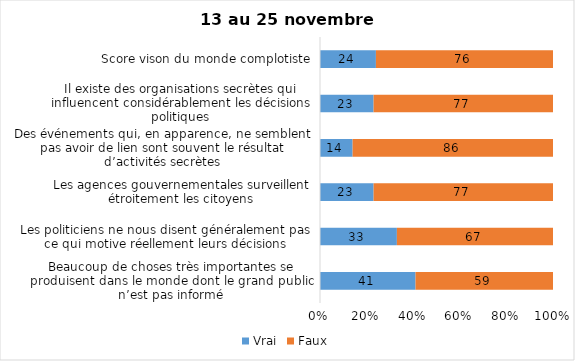
| Category | Vrai | Faux |
|---|---|---|
| Beaucoup de choses très importantes se produisent dans le monde dont le grand public n’est pas informé | 41 | 59 |
| Les politiciens ne nous disent généralement pas ce qui motive réellement leurs décisions | 33 | 67 |
| Les agences gouvernementales surveillent étroitement les citoyens | 23 | 77 |
| Des événements qui, en apparence, ne semblent pas avoir de lien sont souvent le résultat d’activités secrètes | 14 | 86 |
| Il existe des organisations secrètes qui influencent considérablement les décisions politiques | 23 | 77 |
| Score vison du monde complotiste | 24 | 76 |